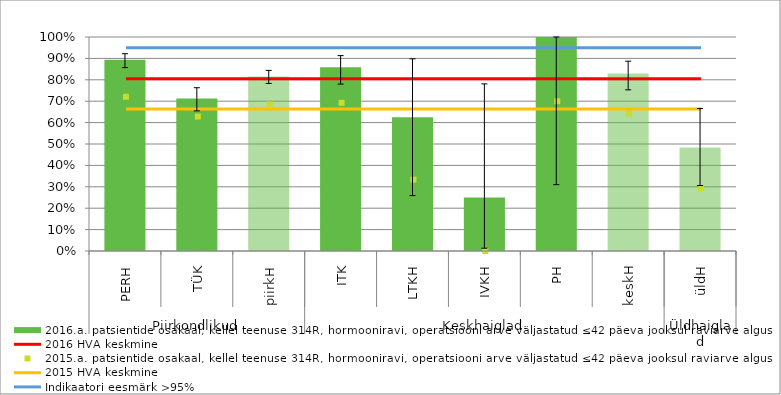
| Category | 2016.a. patsientide osakaal, kellel teenuse 314R, hormooniravi, operatsiooni arve väljastatud ≤42 päeva jooksul raviarve algusest |
|---|---|
| 0 | 0.894 |
| 1 | 0.712 |
| 2 | 0.815 |
| 3 | 0.858 |
| 4 | 0.625 |
| 5 | 0.25 |
| 6 | 1 |
| 7 | 0.83 |
| 8 | 0.484 |